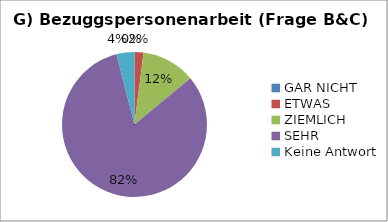
| Category | Series 0 |
|---|---|
| GAR NICHT | 0 |
| ETWAS | 1 |
| ZIEMLICH | 6 |
| SEHR | 41 |
| Keine Antwort | 2 |